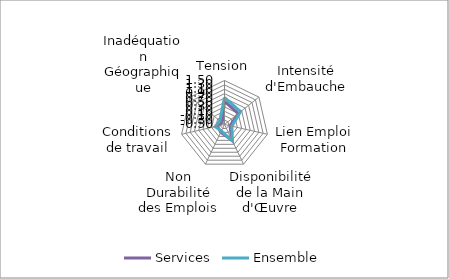
| Category | Services | Ensemble |
|---|---|---|
| Tension | 0.553 | 0.728 |
| Intensité d'Embauche | 0.3 | 0.434 |
| Lien Emploi Formation | -0.246 | -0.153 |
| Disponibilité de la Main d'Œuvre | 0.3 | 0.338 |
| Non Durabilité des Emplois | -0.107 | -0.177 |
| Conditions de travail | -0.167 | -0.058 |
| Inadéquation Géographique | -0.363 | -0.228 |